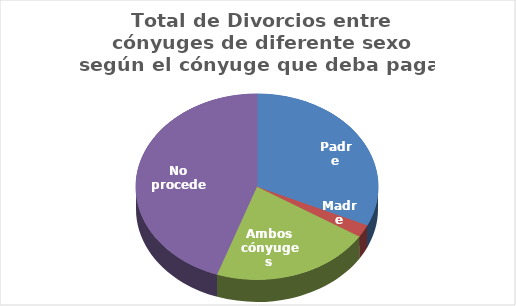
| Category | Series 0 |
|---|---|
| Padre | 25333 |
| Madre | 1713 |
| Ambos cónyuges | 16970 |
| No procede | 35537 |